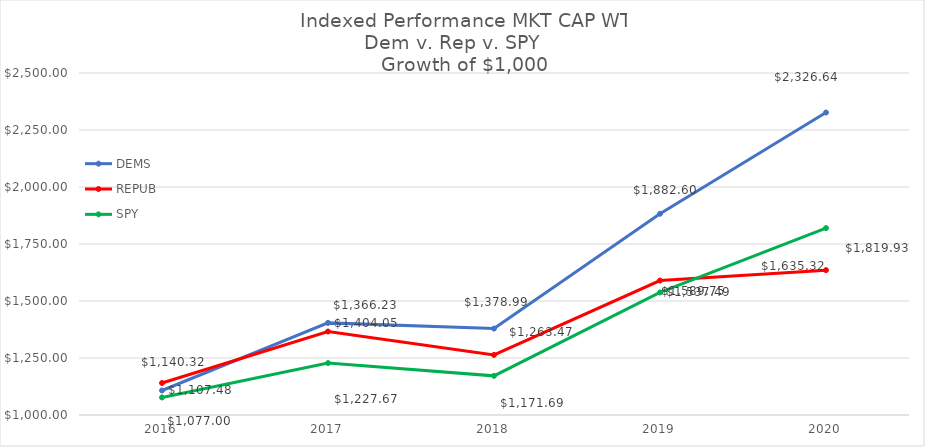
| Category | DEMS | REPUB | SPY |
|---|---|---|---|
| 2020.0 | 2326.643 | 1635.323 | 1819.93 |
| 2019.0 | 1882.598 | 1589.752 | 1537.492 |
| 2018.0 | 1378.985 | 1263.468 | 1171.69 |
| 2017.0 | 1404.047 | 1366.227 | 1227.672 |
| 2016.0 | 1107.478 | 1140.318 | 1077 |